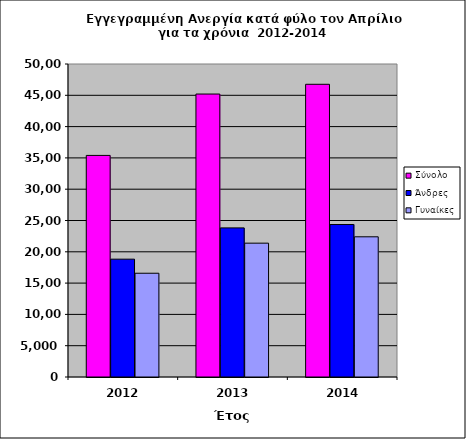
| Category | Σύνολο | Άνδρες  | Γυναίκες  |
|---|---|---|---|
| 2012.0 | 35398 | 18823 | 16575 |
| 2013.0 | 45201 | 23821 | 21380 |
| 2014.0 | 46758 | 24362 | 22396 |